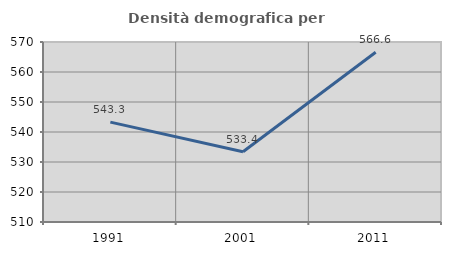
| Category | Densità demografica |
|---|---|
| 1991.0 | 543.289 |
| 2001.0 | 533.439 |
| 2011.0 | 566.58 |